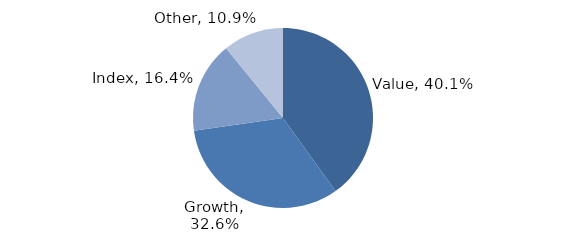
| Category | Investment Style |
|---|---|
| Value | 0.401 |
| Growth | 0.326 |
| Index | 0.164 |
| Other | 0.109 |